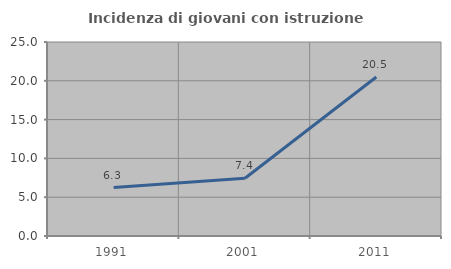
| Category | Incidenza di giovani con istruzione universitaria |
|---|---|
| 1991.0 | 6.25 |
| 2001.0 | 7.438 |
| 2011.0 | 20.482 |